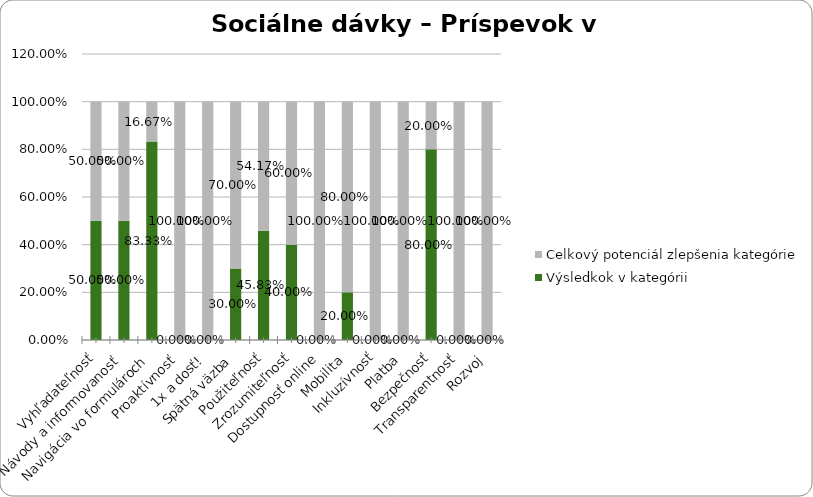
| Category | Výsledkok v kategórii | Celkový potenciál zlepšenia kategórie |
|---|---|---|
| Vyhľadateľnosť | 0.5 | 0.5 |
| Návody a informovanosť | 0.5 | 0.5 |
| Navigácia vo formulároch | 0.833 | 0.167 |
| Proaktívnosť | 0 | 1 |
| 1x a dosť! | 0 | 1 |
| Spätná väzba | 0.3 | 0.7 |
| Použiteľnosť | 0.458 | 0.542 |
| Zrozumiteľnosť | 0.4 | 0.6 |
| Dostupnosť online | 0 | 1 |
| Mobilita | 0.2 | 0.8 |
| Inkluzívnosť | 0 | 1 |
| Platba | 0 | 1 |
| Bezpečnosť | 0.8 | 0.2 |
| Transparentnosť | 0 | 1 |
| Rozvoj | 0 | 1 |